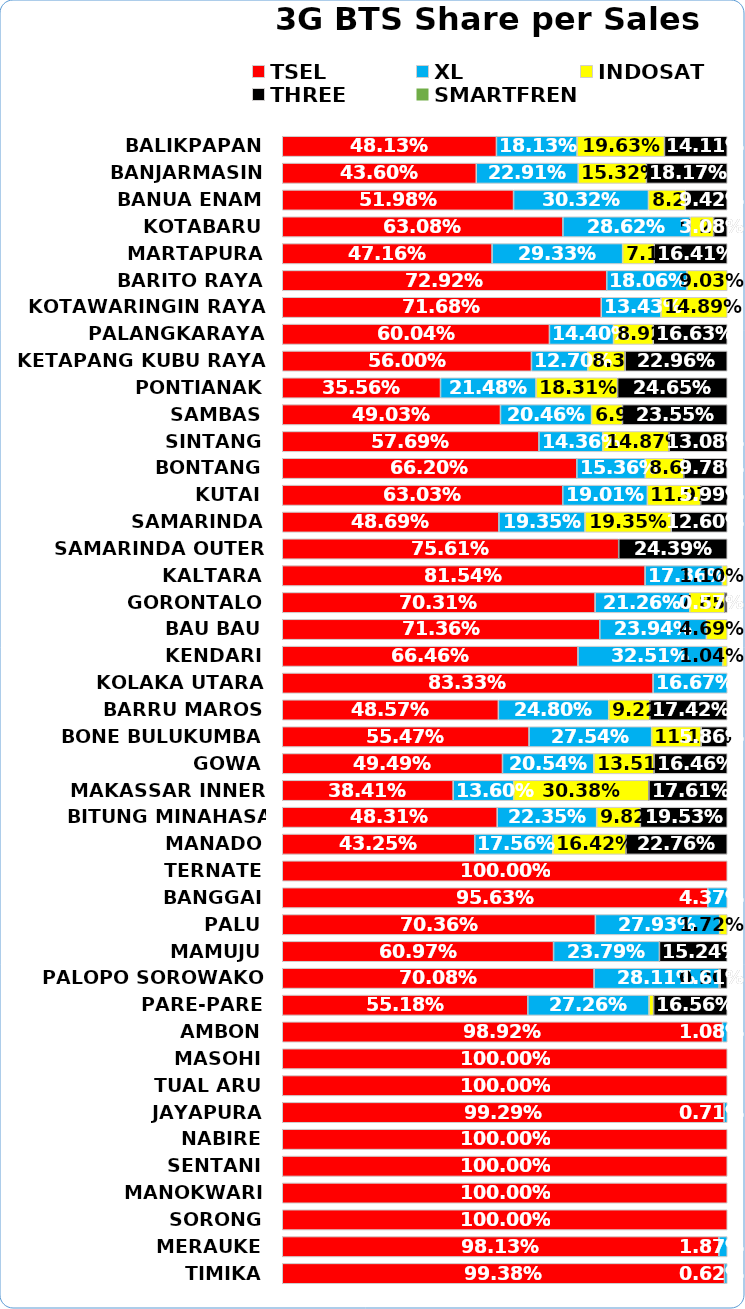
| Category | TSEL | XL | INDOSAT | THREE | SMARTFREN |
|---|---|---|---|---|---|
| BALIKPAPAN | 0.481 | 0.181 | 0.196 | 0.141 | 0 |
| BANJARMASIN | 0.436 | 0.229 | 0.153 | 0.182 | 0 |
| BANUA ENAM | 0.52 | 0.303 | 0.083 | 0.094 | 0 |
| KOTABARU | 0.631 | 0.286 | 0.052 | 0.031 | 0 |
| MARTAPURA | 0.472 | 0.293 | 0.071 | 0.164 | 0 |
| BARITO RAYA | 0.729 | 0.181 | 0.09 | 0 | 0 |
| KOTAWARINGIN RAYA | 0.717 | 0.134 | 0.149 | 0 | 0 |
| PALANGKARAYA | 0.6 | 0.144 | 0.089 | 0.166 | 0 |
| KETAPANG KUBU RAYA | 0.56 | 0.127 | 0.083 | 0.23 | 0 |
| PONTIANAK | 0.356 | 0.215 | 0.183 | 0.246 | 0 |
| SAMBAS | 0.49 | 0.205 | 0.069 | 0.236 | 0 |
| SINTANG | 0.577 | 0.144 | 0.149 | 0.131 | 0 |
| BONTANG | 0.662 | 0.154 | 0.087 | 0.098 | 0 |
| KUTAI | 0.63 | 0.19 | 0.12 | 0.06 | 0 |
| SAMARINDA | 0.487 | 0.194 | 0.194 | 0.126 | 0 |
| SAMARINDA OUTER | 0.756 | 0 | 0 | 0.244 | 0 |
| KALTARA | 0.815 | 0.174 | 0.011 | 0 | 0 |
| GORONTALO | 0.703 | 0.213 | 0.079 | 0.006 | 0 |
| BAU BAU | 0.714 | 0.239 | 0.047 | 0 | 0 |
| KENDARI | 0.665 | 0.325 | 0.01 | 0 | 0 |
| KOLAKA UTARA | 0.833 | 0.167 | 0 | 0 | 0 |
| BARRU MAROS | 0.486 | 0.248 | 0.092 | 0.174 | 0 |
| BONE BULUKUMBA | 0.555 | 0.275 | 0.111 | 0.059 | 0 |
| GOWA | 0.495 | 0.205 | 0.135 | 0.165 | 0 |
| MAKASSAR INNER | 0.384 | 0.136 | 0.304 | 0.176 | 0 |
| BITUNG MINAHASA TALAUD | 0.483 | 0.223 | 0.098 | 0.195 | 0 |
| MANADO | 0.433 | 0.176 | 0.164 | 0.228 | 0 |
| TERNATE | 1 | 0 | 0 | 0 | 0 |
| BANGGAI | 0.956 | 0.044 | 0 | 0 | 0 |
| PALU | 0.704 | 0.279 | 0.017 | 0 | 0 |
| MAMUJU | 0.61 | 0.238 | 0 | 0.152 | 0 |
| PALOPO SOROWAKO | 0.701 | 0.281 | 0.002 | 0.016 | 0 |
| PARE-PARE | 0.552 | 0.273 | 0.01 | 0.166 | 0 |
| AMBON | 0.989 | 0.011 | 0 | 0 | 0 |
| MASOHI | 1 | 0 | 0 | 0 | 0 |
| TUAL ARU | 1 | 0 | 0 | 0 | 0 |
| JAYAPURA | 0.993 | 0.007 | 0 | 0 | 0 |
| NABIRE | 1 | 0 | 0 | 0 | 0 |
| SENTANI | 1 | 0 | 0 | 0 | 0 |
| MANOKWARI | 1 | 0 | 0 | 0 | 0 |
| SORONG | 1 | 0 | 0 | 0 | 0 |
| MERAUKE | 0.981 | 0.019 | 0 | 0 | 0 |
| TIMIKA | 0.994 | 0.006 | 0 | 0 | 0 |